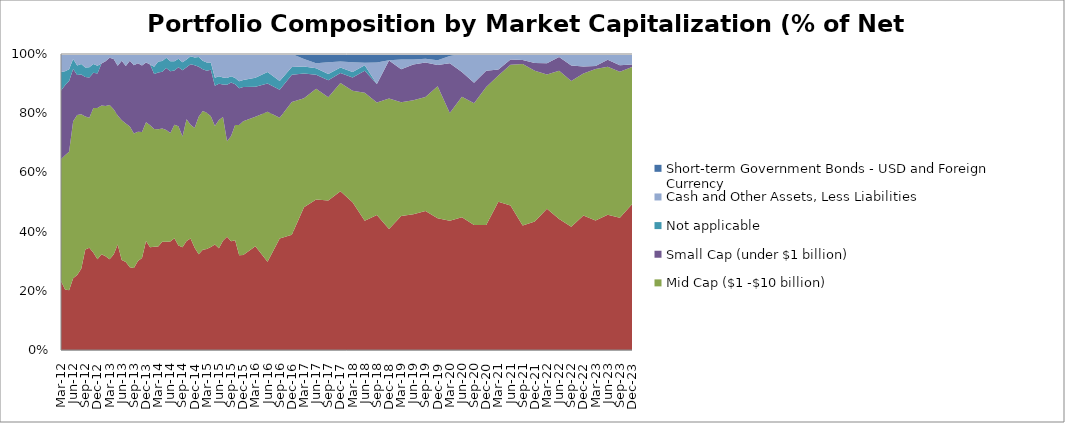
| Category | Large Cap (over $10 billion) | Mid Cap ($1 -$10 billion) | Small Cap (under $1 billion) | Not applicable | Cash and Other Assets, Less Liabilities | Short-term Government Bonds - USD and Foreign Currency |
|---|---|---|---|---|---|---|
| 2012-03-31 | 23.305 | 41.13 | 23.254 | 6.188 | 6.123 | 0 |
| 2012-04-30 | 20.45 | 45.32 | 23.66 | 4.71 | 5.84 | 0 |
| 2012-05-31 | 20.19 | 46.75 | 23.9 | 4.01 | 5.15 | 0 |
| 2012-06-30 | 24.26 | 53 | 17.7 | 3.39 | 1.65 | 0 |
| 2012-07-31 | 25.37 | 53.98 | 13.52 | 3.24 | 3.89 | 0 |
| 2012-08-31 | 27.45 | 52.23 | 13.37 | 3.56 | 3.39 | 0 |
| 2012-09-30 | 33.92 | 44.94 | 13.35 | 3.24 | 4.55 | 0 |
| 2012-10-31 | 34.53 | 43.92 | 13.64 | 3.4 | 4.51 | 0 |
| 2012-11-30 | 32.82 | 48.96 | 11.85 | 3.01 | 3.36 | 0 |
| 2012-12-31 | 30.66 | 51.07 | 11.72 | 2.59 | 3.96 | 0 |
| 2013-01-31 | 32.33 | 50.24 | 14.25 | 0 | 3.18 | 0 |
| 2013-02-28 | 31.69 | 50.74 | 15.15 | 0 | 2.42 | 0 |
| 2013-03-31 | 30.7 | 52.1 | 15.93 | 0 | 1.27 | 0 |
| 2013-04-30 | 32.24 | 49.06 | 17.03 | 0 | 1.67 | 0 |
| 2013-05-31 | 35.68 | 43.58 | 16.73 | 0 | 4.01 | 0 |
| 2013-06-30 | 30.42 | 47.2 | 20.07 | 0 | 2.31 | 0 |
| 2013-07-31 | 29.74 | 46.76 | 19.48 | 0 | 4.02 | 0 |
| 2013-08-31 | 27.95 | 47.57 | 22.24 | 0 | 2.24 | 0 |
| 2013-09-30 | 27.72 | 45.41 | 23.07 | 0 | 3.8 | 0 |
| 2013-10-31 | 30.05 | 43.71 | 23.11 | 0 | 3.12 | 0 |
| 2013-11-30 | 31.1 | 42.56 | 22.48 | 0 | 3.86 | 0 |
| 2013-12-31 | 36.86 | 40.07 | 20.21 | 0 | 2.86 | 0 |
| 2014-01-31 | 34.71 | 41.2 | 20.56 | 0 | 3.53 | 0 |
| 2014-02-28 | 34.9 | 39.75 | 18.54 | 2.45 | 4.33 | 0 |
| 2014-03-31 | 34.991 | 39.554 | 19.203 | 3.749 | 2.503 | 0 |
| 2014-04-30 | 36.55 | 38.25 | 19.22 | 3.63 | 2.35 | 0 |
| 2014-05-31 | 36.54 | 37.76 | 20.93 | 3.52 | 1.25 | 0 |
| 2014-06-30 | 36.63 | 36.72 | 20.8 | 3.39 | 2.46 | 0 |
| 2014-07-31 | 37.72 | 38.36 | 18.31 | 3.17 | 2.44 | 0 |
| 2014-08-31 | 35.33 | 40.24 | 19.97 | 2.84 | 1.614 | 0 |
| 2014-09-30 | 34.73 | 37.42 | 22.36 | 2.7 | 2.79 | 0 |
| 2014-10-31 | 36.85 | 41.11 | 17.59 | 2.63 | 1.82 | 0 |
| 2014-11-30 | 37.65 | 38.44 | 20.46 | 2.69 | 0.76 | 0 |
| 2014-12-31 | 34.55 | 40.43 | 21.21 | 2.61 | 1.2 | 0 |
| 2015-01-31 | 32.32 | 46.49 | 16.9 | 3.31 | 0.98 | 0 |
| 2015-02-28 | 33.91 | 46.86 | 14.07 | 2.91 | 2.25 | 0 |
| 2015-03-31 | 34.09 | 46.06 | 14.18 | 2.82 | 2.85 | 0 |
| 2015-04-30 | 34.78 | 44.18 | 15.7 | 2.5 | 2.84 | 0 |
| 2015-05-31 | 35.64 | 40.04 | 13.57 | 2.7 | 8.05 | 0 |
| 2015-06-30 | 34.38 | 43.3 | 12.25 | 2.53 | 7.54 | 0 |
| 2015-07-31 | 36.9 | 41.82 | 10.98 | 2.32 | 7.98 | 0 |
| 2015-08-31 | 38.22 | 32.33 | 19.03 | 2.3 | 8.12 | 0 |
| 2015-09-30 | 36.76 | 35.51 | 18.08 | 2.15 | 7.5 | 0 |
| 2015-10-31 | 37.11 | 38.94 | 13.7 | 2.17 | 8.08 | 0 |
| 2015-11-30 | 32.03 | 43.97 | 12.44 | 2.32 | 9.24 | 0 |
| 2015-12-31 | 32.06 | 45.23 | 11.52 | 2.38 | 8.81 | 0 |
| 2016-03-31 | 35.01 | 43.83 | 10.09 | 3.03 | 8.04 | 0 |
| 2016-06-30 | 29.78 | 50.68 | 9.54 | 3.91 | 6.09 | 0 |
| 2016-09-30 | 37.69 | 40.81 | 9.45 | 2.94 | 9.11 | 0 |
| 2016-12-31 | 38.94 | 44.87 | 9.19 | 2.57 | 4.43 | 0 |
| 2017-03-31 | 48.23 | 36.79 | 8.39 | 2.34 | 2.59 | 1.66 |
| 2017-06-30 | 50.86 | 37.36 | 4.77 | 2.2 | 1.72 | 3.09 |
| 2017-09-30 | 50.54 | 34.84 | 5.75 | 2.13 | 3.93 | 2.81 |
| 2017-12-31 | 53.62 | 36.56 | 3.4 | 1.87 | 2.01 | 2.54 |
| 2018-03-31 | 49.88 | 37.68 | 4.49 | 1.87 | 3.26 | 2.82 |
| 2018-06-30 | 43.63 | 43.25 | 7.45 | 1.91 | 0.83 | 2.93 |
| 2018-09-30 | 45.65 | 37.98 | 6.22 | 0 | 7.29 | 2.86 |
| 2018-12-31 | 40.91 | 44.06 | 12.84 | 0 | 0.12 | 2.07 |
| 2019-03-31 | 45.31 | 38.41 | 11.16 | 0 | 3.24 | 1.88 |
| 2019-06-30 | 45.87 | 38.47 | 12.11 | 0 | 1.71 | 1.84 |
| 2019-09-30 | 46.96 | 38.55 | 11.61 | 0 | 1.24 | 1.64 |
| 2019-12-31 | 44.5 | 44.63 | 7.18 | 0 | 1.62 | 2.07 |
| 2020-03-31 | 43.63 | 36.45 | 16.76 | 0 | 2.52 | 0.64 |
| 2020-06-30 | 44.84 | 40.7 | 8.39 | 0 | 6.07 | 0 |
| 2020-09-30 | 42.27 | 41.11 | 6.89 | 0 | 9.73 | 0 |
| 2020-12-31 | 42.19 | 46.63 | 5.48 | 0 | 5.7 | 0 |
| 2021-03-31 | 50.11 | 42.61 | 2.07 | 0 | 5.21 | 0 |
| 2021-06-30 | 48.85 | 47.54 | 1.75 | 0 | 1.86 | 0 |
| 2021-09-30 | 42.07 | 54.51 | 1.37 | 0 | 2.05 | 0 |
| 2021-12-31 | 43.39 | 50.92 | 2.63 | 0 | 3.06 | 0 |
| 2022-03-31 | 47.68 | 45.37 | 3.84 | 0 | 3.11 | 0 |
| 2022-06-30 | 44.25 | 50.08 | 4.63 | 0 | 1.04 | 0 |
| 2022-09-30 | 41.63 | 49.28 | 5.22 | 0 | 3.87 | 0 |
| 2022-12-31 | 45.47 | 47.94 | 2.38 | 0 | 4.21 | 0 |
| 2023-03-31 | 43.78 | 51.15 | 0.99 | 0 | 4.08 | 0 |
| 2023-06-30 | 45.69 | 49.97 | 2.4 | 0 | 1.94 | 0 |
| 2023-09-30 | 44.67 | 49.3 | 2.22 | 0 | 3.81 | 0 |
| 2023-12-31 | 49.26 | 46.32 | 0.84 | 0 | 3.58 | 0 |